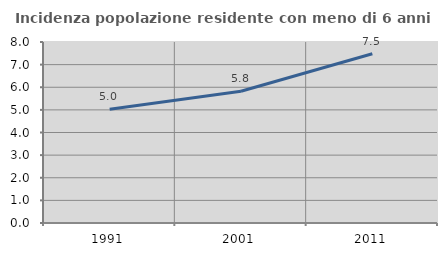
| Category | Incidenza popolazione residente con meno di 6 anni |
|---|---|
| 1991.0 | 5.027 |
| 2001.0 | 5.82 |
| 2011.0 | 7.481 |